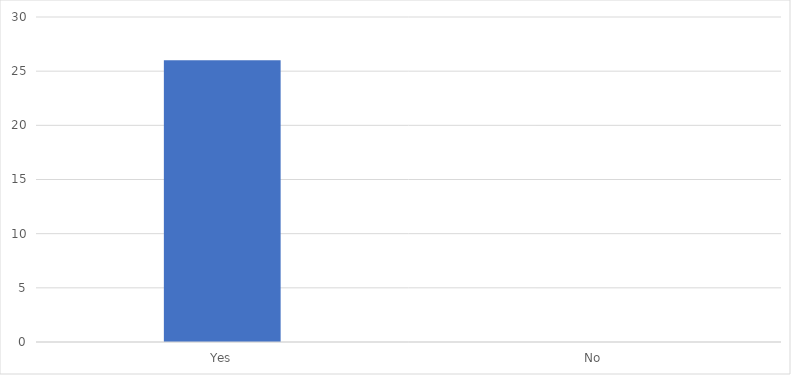
| Category | Number of Responses |
|---|---|
| Yes | 26 |
| No | 0 |